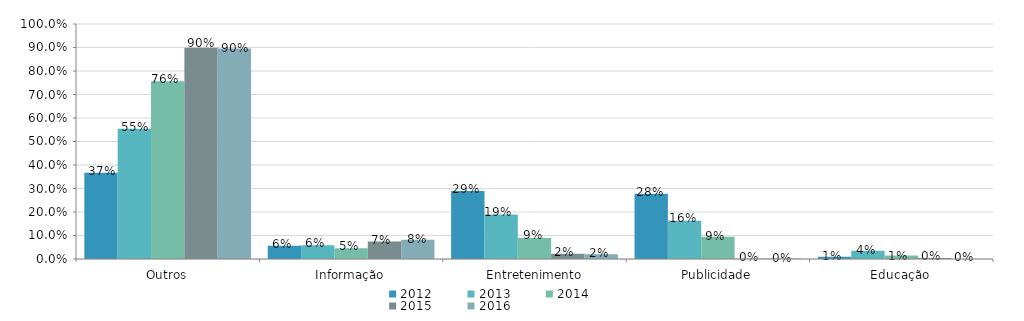
| Category | 2012 | 2013 | 2014 | 2015 | 2016 |
|---|---|---|---|---|---|
| Outros | 0.367 | 0.554 | 0.756 | 0.898 | 0.896 |
| Informação | 0.056 | 0.058 | 0.045 | 0.074 | 0.082 |
| Entretenimento | 0.289 | 0.19 | 0.089 | 0.022 | 0.02 |
| Publicidade | 0.278 | 0.163 | 0.095 | 0.001 | 0.002 |
| Educação | 0.01 | 0.035 | 0.015 | 0.004 | 0 |